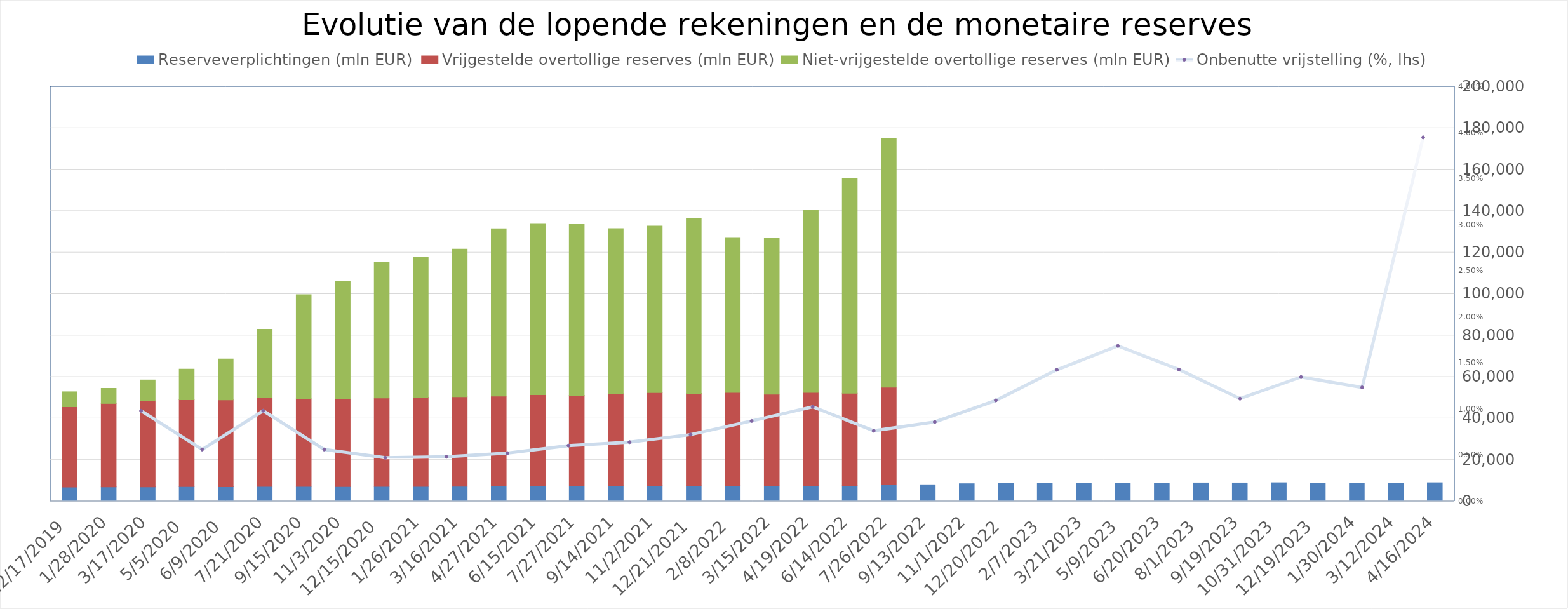
| Category | Reserveverplichtingen (mln EUR) | Vrijgestelde overtollige reserves (mln EUR) | Niet-vrijgestelde overtollige reserves (mln EUR) |
|---|---|---|---|
| 4/16/24 | 8997 | 0 | 0 |
| 3/12/24 | 8722 | 0 | 0 |
| 1/30/24 | 8741.019 | 0 | 0 |
| 12/19/23 | 8762 | 0 | 0 |
| 10/31/23 | 9001 | 0 | 0 |
| 9/19/23 | 8896 | 0 | 0 |
| 8/1/23 | 8904 | 0 | 0 |
| 6/20/23 | 8799 | 0 | 0 |
| 5/9/23 | 8796 | 0 | 0 |
| 3/21/23 | 8668 | 0 | 0 |
| 2/7/23 | 8736 | 0 | 0 |
| 12/20/22 | 8689 | 0 | 0 |
| 11/1/22 | 8517 | 0 | 0 |
| 9/13/22 | 8018 | 0 | 0 |
| 7/26/22 | 7929 | 47109 | 119909 |
| 6/14/22 | 7495 | 44621 | 103454 |
| 4/19/22 | 7536 | 44962 | 87885 |
| 3/15/22 | 7409 | 44244 | 75192 |
| 2/8/22 | 7536 | 44997 | 74696 |
| 12/21/21 | 7472 | 44599 | 84381 |
| 11/2/21 | 7531 | 44914 | 80355 |
| 9/14/21 | 7460 | 44471 | 79647 |
| 7/27/21 | 7352 | 43793 | 82435 |
| 6/15/21 | 7404 | 44036 | 82520 |
| 4/27/21 | 7313 | 43430 | 80697 |
| 3/16/21 | 7254 | 43192 | 71224 |
| 1/26/21 | 7225 | 42978 | 67723 |
| 12/15/20 | 7190 | 42671 | 65344 |
| 11/3/20 | 7128 | 42161 | 56951 |
| 9/15/20 | 7165 | 42265 | 50289 |
| 7/21/20 | 7217 | 42685 | 33099 |
| 6/9/20 | 7060 | 41891 | 19741 |
| 5/5/20 | 7085 | 41937 | 14783 |
| 3/17/20 | 7002 | 41491 | 10061 |
| 1/28/20 | 6981 | 40234 | 7303 |
| 12/17/19 | 6887 | 38752 | 7220 |